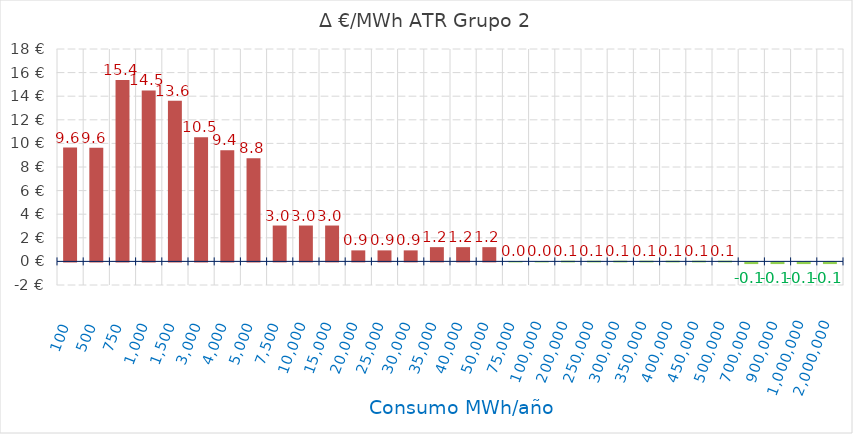
| Category | D €/MWh |
|---|---|
| 100.0 | 9.643 |
| 500.0 | 9.633 |
| 750.0 | 15.38 |
| 1000.0 | 14.492 |
| 1500.0 | 13.604 |
| 3000.0 | 10.529 |
| 4000.0 | 9.418 |
| 5000.0 | 8.752 |
| 7500.0 | 3.04 |
| 10000.0 | 3.04 |
| 15000.0 | 3.04 |
| 20000.0 | 0.934 |
| 25000.0 | 0.934 |
| 30000.0 | 0.934 |
| 35000.0 | 1.207 |
| 40000.0 | 1.207 |
| 50000.0 | 1.207 |
| 75000.0 | 0.033 |
| 100000.0 | 0.033 |
| 200000.0 | 0.061 |
| 250000.0 | 0.061 |
| 300000.0 | 0.061 |
| 350000.0 | 0.061 |
| 400000.0 | 0.061 |
| 450000.0 | 0.061 |
| 500000.0 | 0.061 |
| 700000.0 | -0.143 |
| 900000.0 | -0.143 |
| 1000000.0 | -0.143 |
| 2000000.0 | -0.143 |